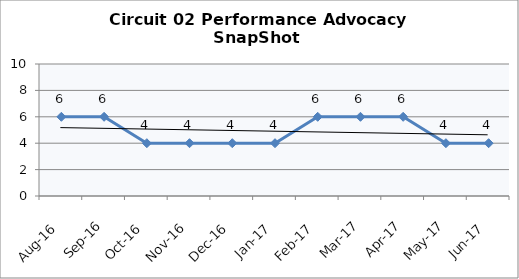
| Category | Circuit 02 |
|---|---|
| Aug-16 | 6 |
| Sep-16 | 6 |
| Oct-16 | 4 |
| Nov-16 | 4 |
| Dec-16 | 4 |
| Jan-17 | 4 |
| Feb-17 | 6 |
| Mar-17 | 6 |
| Apr-17 | 6 |
| May-17 | 4 |
| Jun-17 | 4 |